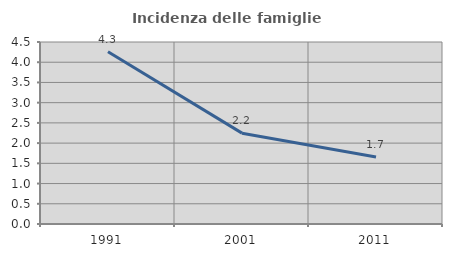
| Category | Incidenza delle famiglie numerose |
|---|---|
| 1991.0 | 4.259 |
| 2001.0 | 2.246 |
| 2011.0 | 1.655 |